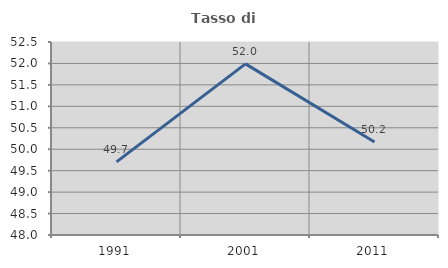
| Category | Tasso di occupazione   |
|---|---|
| 1991.0 | 49.704 |
| 2001.0 | 51.99 |
| 2011.0 | 50.167 |